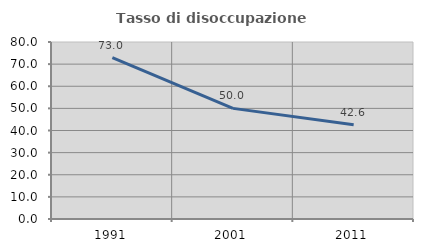
| Category | Tasso di disoccupazione giovanile  |
|---|---|
| 1991.0 | 72.973 |
| 2001.0 | 50 |
| 2011.0 | 42.647 |